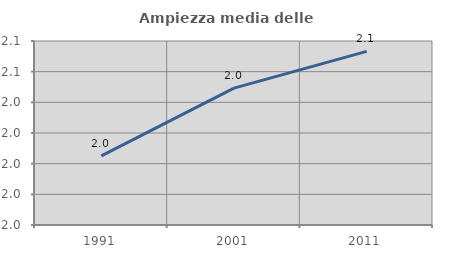
| Category | Ampiezza media delle famiglie |
|---|---|
| 1991.0 | 2.023 |
| 2001.0 | 2.045 |
| 2011.0 | 2.057 |